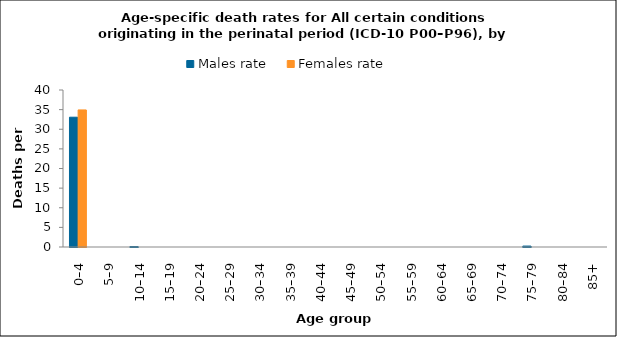
| Category | Males rate | Females rate |
|---|---|---|
| 0–4 | 33.065 | 34.927 |
| 5–9 | 0 | 0 |
| 10–14 | 0.119 | 0 |
| 15–19 | 0 | 0 |
| 20–24 | 0 | 0 |
| 25–29 | 0 | 0 |
| 30–34 | 0 | 0 |
| 35–39 | 0 | 0 |
| 40–44 | 0 | 0 |
| 45–49 | 0 | 0 |
| 50–54 | 0 | 0 |
| 55–59 | 0 | 0 |
| 60–64 | 0 | 0 |
| 65–69 | 0 | 0 |
| 70–74 | 0 | 0 |
| 75–79 | 0.239 | 0 |
| 80–84 | 0 | 0 |
| 85+ | 0 | 0 |